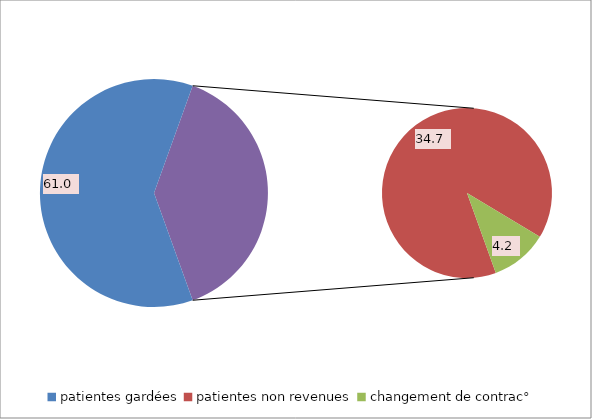
| Category | Series 0 |
|---|---|
| patientes gardées | 61.017 |
| patientes non revenues | 34.746 |
| changement de contrac° | 4.237 |